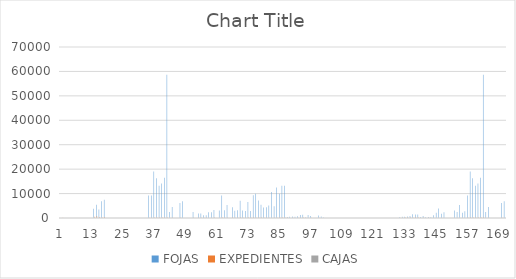
| Category | FOJAS | EXPEDIENTES | CAJAS |
|---|---|---|---|
| 0 | 0 | 0 | 0 |
| 1 | 0 | 138 | 1 |
| 2 | 0 | 0 | 0 |
| 3 | 0 | 0 | 0 |
| 4 | 0 | 0 | 0 |
| 5 | 0 | 0 | 0 |
| 6 | 0 | 0 | 0 |
| 7 | 0 | 0 | 0 |
| 8 | 0 | 0 | 0 |
| 9 | 0 | 0 | 0 |
| 10 | 0 | 0 | 0 |
| 11 | 0 | 0 | 0 |
| 12 | 0 | 0 | 0 |
| 13 | 3827 | 482 | 18 |
| 14 | 5453 | 734 | 21 |
| 15 | 3430 | 452 | 18 |
| 16 | 6819 | 178 | 15 |
| 17 | 7486 | 372 | 15 |
| 18 | 0 | 0 | 0 |
| 19 | 0 | 0 | 0 |
| 20 | 0 | 0 | 0 |
| 21 | 0 | 0 | 0 |
| 22 | 0 | 0 | 0 |
| 23 | 0 | 0 | 0 |
| 24 | 0 | 0 | 0 |
| 25 | 0 | 0 | 0 |
| 26 | 21 | 12 | 1 |
| 27 | 0 | 0 | 0 |
| 28 | 0 | 0 | 0 |
| 29 | 0 | 30 | 0 |
| 30 | 0 | 45 | 0 |
| 31 | 0 | 20 | 0 |
| 32 | 0 | 33 | 0 |
| 33 | 0 | 32 | 2 |
| 34 | 9214 | 87 | 4 |
| 35 | 9214 | 87 | 4 |
| 36 | 19000 | 180 | 9 |
| 37 | 16230 | 165 | 8 |
| 38 | 13221 | 221 | 9 |
| 39 | 14121 | 192 | 9 |
| 40 | 16500 | 225 | 8 |
| 41 | 58653 | 173 | 10 |
| 42 | 2487 | 30 | 3 |
| 43 | 4538 | 123 | 5 |
| 44 | 0 | 0 | 0 |
| 45 | 0 | 0 | 0 |
| 46 | 6102 | 145 | 7 |
| 47 | 6865 | 47 | 4 |
| 48 | 0 | 0 | 0 |
| 49 | 0 | 0 | 0 |
| 50 | 0 | 0 | 0 |
| 51 | 2492 | 90 | 1 |
| 52 | 0 | 0 | 0 |
| 53 | 1839 | 53 | 1 |
| 54 | 1838 | 53 | 1 |
| 55 | 1149 | 79 | 1 |
| 56 | 1149 | 79 | 1 |
| 57 | 2328 | 39 | 1 |
| 58 | 2327 | 40 | 1 |
| 59 | 3319 | 157 | 1 |
| 60 | 0 | 0 | 0 |
| 61 | 3112 | 47 | 1 |
| 62 | 9195 | 186 | 2 |
| 63 | 3195 | 77 | 1 |
| 64 | 5284 | 120 | 2 |
| 65 | 0 | 0 | 0 |
| 66 | 4395 | 185 | 2 |
| 67 | 2966 | 108 | 1 |
| 68 | 3160 | 83 | 1 |
| 69 | 7052 | 213 | 1 |
| 70 | 3104 | 112 | 1 |
| 71 | 2905 | 83 | 1 |
| 72 | 6576 | 156 | 2 |
| 73 | 2875 | 81 | 1 |
| 74 | 9327 | 156 | 2 |
| 75 | 9918 | 104 | 2 |
| 76 | 7157 | 177 | 2 |
| 77 | 5396 | 177 | 2 |
| 78 | 4290 | 116 | 2 |
| 79 | 4422 | 100 | 2 |
| 80 | 5075 | 63 | 2 |
| 81 | 10643 | 28 | 2 |
| 82 | 4766 | 90 | 2 |
| 83 | 12531 | 97 | 2 |
| 84 | 9885 | 205 | 3 |
| 85 | 13248 | 156 | 4 |
| 86 | 13213 | 160 | 4 |
| 87 | 423 | 70 | 2 |
| 88 | 545 | 35 | 3 |
| 89 | 656 | 53 | 3 |
| 90 | 463 | 35 | 3 |
| 91 | 729 | 108 | 2 |
| 92 | 1250 | 95 | 4 |
| 93 | 1321 | 254 | 5 |
| 94 | 216 | 63 | 2 |
| 95 | 1237 | 28 | 2 |
| 96 | 784 | 53 | 2 |
| 97 | 0 | 0 | 0 |
| 98 | 0 | 0 | 0 |
| 99 | 1001 | 90 | 3 |
| 100 | 664 | 42 | 2 |
| 101 | 214 | 27 | 1 |
| 102 | 0 | 9 | 3 |
| 103 | 0 | 0 | 0 |
| 104 | 0 | 4 | 3 |
| 105 | 0 | 0 | 0 |
| 106 | 0 | 8 | 3 |
| 107 | 0 | 10 | 4 |
| 108 | 0 | 0 | 0 |
| 109 | 0 | 0 | 0 |
| 110 | 0 | 0 | 0 |
| 111 | 0 | 0 | 0 |
| 112 | 0 | 0 | 0 |
| 113 | 0 | 0 | 0 |
| 114 | 0 | 0 | 0 |
| 115 | 0 | 0 | 0 |
| 116 | 0 | 0 | 0 |
| 117 | 0 | 0 | 0 |
| 118 | 0 | 0 | 0 |
| 119 | 0 | 0 | 0 |
| 120 | 0 | 0 | 0 |
| 121 | 0 | 0 | 0 |
| 122 | 0 | 0 | 0 |
| 123 | 0 | 0 | 0 |
| 124 | 0 | 0 | 0 |
| 125 | 0 | 0 | 0 |
| 126 | 0 | 0 | 0 |
| 127 | 0 | 0 | 0 |
| 128 | 0 | 0 | 0 |
| 129 | 0 | 0 | 0 |
| 130 | 318 | 128 | 2 |
| 131 | 469 | 130 | 2 |
| 132 | 519 | 170 | 3 |
| 133 | 645 | 178 | 2 |
| 134 | 803 | 165 | 2 |
| 135 | 1543 | 87 | 3 |
| 136 | 1454 | 268 | 6 |
| 137 | 1440 | 158 | 4 |
| 138 | 367 | 27 | 1 |
| 139 | 792 | 83 | 2 |
| 140 | 277 | 37 | 2 |
| 141 | 434 | 74 | 2 |
| 142 | 296 | 43 | 1 |
| 143 | 1160 | 12 | 1 |
| 144 | 2167 | 7 | 1 |
| 145 | 3844 | 19 | 1 |
| 146 | 1766 | 12 | 1 |
| 147 | 2349 | 14 | 1 |
| 148 | 0 | 0 | 0 |
| 149 | 0 | 0 | 0 |
| 150 | 0 | 0 | 0 |
| 151 | 3038 | 17 | 2 |
| 152 | 2502 | 12 | 1 |
| 153 | 5354 | 25 | 1 |
| 154 | 2126 | 14 | 1 |
| 155 | 2714 | 39 | 1 |
| 156 | 9214 | 87 | 4 |
| 157 | 19000 | 180 | 9 |
| 158 | 16230 | 165 | 8 |
| 159 | 13221 | 221 | 9 |
| 160 | 14121 | 192 | 9 |
| 161 | 16500 | 225 | 8 |
| 162 | 58653 | 173 | 10 |
| 163 | 2487 | 30 | 3 |
| 164 | 4538 | 123 | 5 |
| 165 | 0 | 0 | 0 |
| 166 | 0 | 0 | 0 |
| 167 | 0 | 0 | 0 |
| 168 | 0 | 0 | 0 |
| 169 | 6102 | 145 | 7 |
| 170 | 6865 | 47 | 4 |